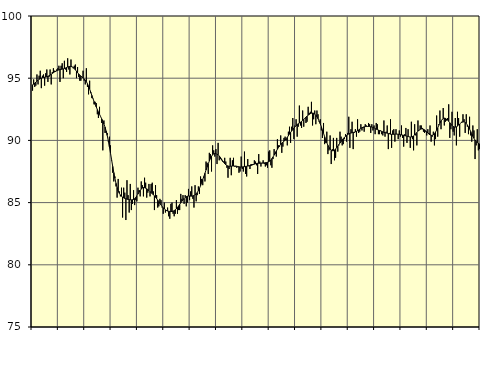
| Category | Piggar | Series 1 |
|---|---|---|
| nan | 94 | 94.47 |
| 87.0 | 94.9 | 94.52 |
| 87.0 | 94.3 | 94.6 |
| 87.0 | 94.4 | 94.69 |
| 87.0 | 95.3 | 94.77 |
| 87.0 | 94.5 | 94.84 |
| 87.0 | 95.2 | 94.91 |
| 87.0 | 95.6 | 94.97 |
| 87.0 | 94.2 | 95.01 |
| 87.0 | 95.2 | 95.04 |
| 87.0 | 95.3 | 95.06 |
| 87.0 | 94.4 | 95.08 |
| nan | 95.4 | 95.09 |
| 88.0 | 95.7 | 95.11 |
| 88.0 | 94.7 | 95.15 |
| 88.0 | 95.1 | 95.19 |
| 88.0 | 95.7 | 95.25 |
| 88.0 | 94.5 | 95.31 |
| 88.0 | 95.5 | 95.38 |
| 88.0 | 95.8 | 95.44 |
| 88.0 | 95.6 | 95.5 |
| 88.0 | 95.5 | 95.56 |
| 88.0 | 95.7 | 95.6 |
| 88.0 | 95.8 | 95.64 |
| nan | 96 | 95.67 |
| 89.0 | 94.7 | 95.7 |
| 89.0 | 96 | 95.71 |
| 89.0 | 96.2 | 95.73 |
| 89.0 | 95 | 95.75 |
| 89.0 | 96.4 | 95.78 |
| 89.0 | 95.7 | 95.82 |
| 89.0 | 95.5 | 95.86 |
| 89.0 | 96.6 | 95.9 |
| 89.0 | 95.7 | 95.93 |
| 89.0 | 95.3 | 95.95 |
| 89.0 | 96.5 | 95.95 |
| nan | 95.9 | 95.91 |
| 90.0 | 95.8 | 95.86 |
| 90.0 | 96 | 95.78 |
| 90.0 | 96.1 | 95.67 |
| 90.0 | 95 | 95.56 |
| 90.0 | 95.9 | 95.45 |
| 90.0 | 95.1 | 95.34 |
| 90.0 | 94.8 | 95.25 |
| 90.0 | 94.8 | 95.17 |
| 90.0 | 95.1 | 95.1 |
| 90.0 | 95.6 | 95.03 |
| 90.0 | 94.8 | 94.95 |
| nan | 94.5 | 94.85 |
| 91.0 | 95.8 | 94.72 |
| 91.0 | 94.3 | 94.56 |
| 91.0 | 93.7 | 94.36 |
| 91.0 | 94.8 | 94.13 |
| 91.0 | 93.8 | 93.88 |
| 91.0 | 93.4 | 93.62 |
| 91.0 | 93.4 | 93.37 |
| 91.0 | 92.9 | 93.13 |
| 91.0 | 93.1 | 92.9 |
| 91.0 | 93 | 92.69 |
| 91.0 | 92.1 | 92.48 |
| nan | 91.8 | 92.29 |
| 92.0 | 92.7 | 92.1 |
| 92.0 | 91.9 | 91.91 |
| 92.0 | 91.4 | 91.73 |
| 92.0 | 89.2 | 91.54 |
| 92.0 | 91.6 | 91.32 |
| 92.0 | 90.6 | 91.07 |
| 92.0 | 90.6 | 90.76 |
| 92.0 | 90.6 | 90.4 |
| 92.0 | 89.9 | 89.97 |
| 92.0 | 90.3 | 89.48 |
| 92.0 | 89.6 | 88.97 |
| nan | 88.4 | 88.44 |
| 93.0 | 87.4 | 87.91 |
| 93.0 | 86.7 | 87.41 |
| 93.0 | 87.1 | 86.96 |
| 93.0 | 86.3 | 86.55 |
| 93.0 | 85.4 | 86.22 |
| 93.0 | 86.9 | 85.95 |
| 93.0 | 85.9 | 85.75 |
| 93.0 | 85.5 | 85.61 |
| 93.0 | 86.2 | 85.51 |
| 93.0 | 83.8 | 85.44 |
| 93.0 | 86.2 | 85.38 |
| nan | 85.8 | 85.34 |
| 94.0 | 83.6 | 85.31 |
| 94.0 | 86.8 | 85.28 |
| 94.0 | 85.6 | 85.26 |
| 94.0 | 84.2 | 85.24 |
| 94.0 | 86.5 | 85.23 |
| 94.0 | 84.4 | 85.22 |
| 94.0 | 84.9 | 85.23 |
| 94.0 | 86 | 85.25 |
| 94.0 | 84.8 | 85.31 |
| 94.0 | 85.2 | 85.41 |
| 94.0 | 85.1 | 85.54 |
| nan | 86.2 | 85.69 |
| 95.0 | 86 | 85.84 |
| 95.0 | 85.5 | 85.99 |
| 95.0 | 86.7 | 86.09 |
| 95.0 | 86.4 | 86.17 |
| 95.0 | 85.5 | 86.21 |
| 95.0 | 87 | 86.2 |
| 95.0 | 86.6 | 86.16 |
| 95.0 | 85.4 | 86.11 |
| 95.0 | 85.8 | 86.04 |
| 95.0 | 86.5 | 85.96 |
| 95.0 | 85.5 | 85.88 |
| nan | 86.5 | 85.8 |
| 96.0 | 86.6 | 85.72 |
| 96.0 | 85.9 | 85.63 |
| 96.0 | 84.4 | 85.54 |
| 96.0 | 86.4 | 85.43 |
| 96.0 | 85.6 | 85.32 |
| 96.0 | 84.6 | 85.2 |
| 96.0 | 84.7 | 85.07 |
| 96.0 | 85.3 | 84.94 |
| 96.0 | 85.2 | 84.81 |
| 96.0 | 84.6 | 84.68 |
| 96.0 | 84.1 | 84.58 |
| nan | 85 | 84.49 |
| 97.0 | 84.2 | 84.42 |
| 97.0 | 84.4 | 84.36 |
| 97.0 | 84.6 | 84.32 |
| 97.0 | 83.9 | 84.3 |
| 97.0 | 83.7 | 84.29 |
| 97.0 | 84.9 | 84.28 |
| 97.0 | 85 | 84.29 |
| 97.0 | 84.1 | 84.31 |
| 97.0 | 83.9 | 84.35 |
| 97.0 | 84.1 | 84.42 |
| 97.0 | 85.2 | 84.51 |
| nan | 84.1 | 84.61 |
| 98.0 | 84.4 | 84.73 |
| 98.0 | 84.4 | 84.86 |
| 98.0 | 85.7 | 84.98 |
| 98.0 | 85.3 | 85.11 |
| 98.0 | 85.6 | 85.23 |
| 98.0 | 84.9 | 85.33 |
| 98.0 | 85.6 | 85.42 |
| 98.0 | 84.7 | 85.48 |
| 98.0 | 85 | 85.51 |
| 98.0 | 86.1 | 85.53 |
| 98.0 | 85.2 | 85.53 |
| nan | 85.9 | 85.52 |
| 99.0 | 86.3 | 85.52 |
| 99.0 | 85.3 | 85.54 |
| 99.0 | 84.6 | 85.57 |
| 99.0 | 86.4 | 85.62 |
| 99.0 | 85.1 | 85.7 |
| 99.0 | 85.6 | 85.81 |
| 99.0 | 86.3 | 85.96 |
| 99.0 | 85.7 | 86.14 |
| 99.0 | 87.1 | 86.36 |
| 99.0 | 86.9 | 86.6 |
| 99.0 | 86.4 | 86.85 |
| nan | 87 | 87.1 |
| 0.0 | 86.7 | 87.36 |
| 0.0 | 88.3 | 87.62 |
| 0.0 | 88.2 | 87.87 |
| 0.0 | 87.3 | 88.12 |
| 0.0 | 89 | 88.34 |
| 0.0 | 88.9 | 88.55 |
| 0.0 | 87.5 | 88.72 |
| 0.0 | 89.6 | 88.85 |
| 0.0 | 89.2 | 88.92 |
| 0.0 | 88.7 | 88.95 |
| 0.0 | 89.3 | 88.94 |
| nan | 88.1 | 88.9 |
| 1.0 | 89.8 | 88.84 |
| 1.0 | 88.4 | 88.75 |
| 1.0 | 88.5 | 88.64 |
| 1.0 | 88.4 | 88.51 |
| 1.0 | 88.3 | 88.37 |
| 1.0 | 88.3 | 88.24 |
| 1.0 | 88.6 | 88.13 |
| 1.0 | 88.3 | 88.04 |
| 1.0 | 87.8 | 87.97 |
| 1.0 | 87 | 87.94 |
| 1.0 | 87.7 | 87.92 |
| nan | 88.6 | 87.92 |
| 2.0 | 87.2 | 87.93 |
| 2.0 | 88.4 | 87.94 |
| 2.0 | 88.6 | 87.94 |
| 2.0 | 87.9 | 87.94 |
| 2.0 | 87.9 | 87.94 |
| 2.0 | 87.8 | 87.92 |
| 2.0 | 87.9 | 87.9 |
| 2.0 | 87.4 | 87.88 |
| 2.0 | 87.5 | 87.86 |
| 2.0 | 88.7 | 87.86 |
| 2.0 | 87.7 | 87.87 |
| nan | 87.5 | 87.88 |
| 3.0 | 89.1 | 87.89 |
| 3.0 | 87.3 | 87.91 |
| 3.0 | 87.1 | 87.92 |
| 3.0 | 88.5 | 87.94 |
| 3.0 | 88 | 87.95 |
| 3.0 | 87.7 | 87.97 |
| 3.0 | 88.1 | 87.99 |
| 3.0 | 88.1 | 88.02 |
| 3.0 | 88.1 | 88.06 |
| 3.0 | 88.4 | 88.09 |
| 3.0 | 88.3 | 88.12 |
| nan | 88 | 88.15 |
| 4.0 | 87.3 | 88.16 |
| 4.0 | 88.9 | 88.16 |
| 4.0 | 88.3 | 88.16 |
| 4.0 | 87.9 | 88.17 |
| 4.0 | 88.2 | 88.17 |
| 4.0 | 88.4 | 88.18 |
| 4.0 | 88.1 | 88.19 |
| 4.0 | 87.9 | 88.21 |
| 4.0 | 88 | 88.22 |
| 4.0 | 87.8 | 88.24 |
| 4.0 | 89.1 | 88.28 |
| nan | 89.2 | 88.33 |
| 5.0 | 88 | 88.42 |
| 5.0 | 87.8 | 88.54 |
| 5.0 | 88.5 | 88.67 |
| 5.0 | 89.3 | 88.82 |
| 5.0 | 88.9 | 88.98 |
| 5.0 | 88.7 | 89.14 |
| 5.0 | 90.1 | 89.29 |
| 5.0 | 89.6 | 89.44 |
| 5.0 | 89.5 | 89.57 |
| 5.0 | 90.4 | 89.68 |
| 5.0 | 89 | 89.77 |
| nan | 89.5 | 89.85 |
| 6.0 | 90.2 | 89.93 |
| 6.0 | 90.3 | 90.02 |
| 6.0 | 90 | 90.13 |
| 6.0 | 89.6 | 90.25 |
| 6.0 | 90.7 | 90.38 |
| 6.0 | 91.1 | 90.51 |
| 6.0 | 89.8 | 90.64 |
| 6.0 | 91.1 | 90.76 |
| 6.0 | 91.8 | 90.87 |
| 6.0 | 90.1 | 90.98 |
| 6.0 | 91.2 | 91.09 |
| nan | 91.7 | 91.19 |
| 7.0 | 90.3 | 91.27 |
| 7.0 | 91.1 | 91.34 |
| 7.0 | 92.8 | 91.4 |
| 7.0 | 91.2 | 91.46 |
| 7.0 | 91 | 91.53 |
| 7.0 | 92.4 | 91.6 |
| 7.0 | 91.1 | 91.69 |
| 7.0 | 91.8 | 91.78 |
| 7.0 | 91.4 | 91.87 |
| 7.0 | 91.5 | 91.95 |
| 7.0 | 92.7 | 92.03 |
| nan | 92.2 | 92.09 |
| 8.0 | 92.3 | 92.15 |
| 8.0 | 93.1 | 92.19 |
| 8.0 | 91.2 | 92.2 |
| 8.0 | 91.7 | 92.18 |
| 8.0 | 92.4 | 92.12 |
| 8.0 | 91.3 | 92.03 |
| 8.0 | 92.4 | 91.9 |
| 8.0 | 92.1 | 91.74 |
| 8.0 | 91.5 | 91.55 |
| 8.0 | 91.7 | 91.34 |
| 8.0 | 90.8 | 91.1 |
| nan | 90.2 | 90.84 |
| 9.0 | 91.4 | 90.57 |
| 9.0 | 89.7 | 90.3 |
| 9.0 | 89.8 | 90.04 |
| 9.0 | 90.7 | 89.81 |
| 9.0 | 88.9 | 89.61 |
| 9.0 | 89.2 | 89.44 |
| 9.0 | 90.4 | 89.3 |
| 9.0 | 88.1 | 89.21 |
| 9.0 | 89.3 | 89.17 |
| 9.0 | 90.2 | 89.17 |
| 9.0 | 88.4 | 89.22 |
| nan | 88.6 | 89.31 |
| 10.0 | 90.2 | 89.42 |
| 10.0 | 89.1 | 89.54 |
| 10.0 | 89.6 | 89.67 |
| 10.0 | 90.7 | 89.79 |
| 10.0 | 90.3 | 89.91 |
| 10.0 | 89.6 | 90.03 |
| 10.0 | 89.7 | 90.14 |
| 10.0 | 90.1 | 90.24 |
| 10.0 | 90.5 | 90.33 |
| 10.0 | 89.9 | 90.4 |
| 10.0 | 90.6 | 90.46 |
| nan | 91.9 | 90.52 |
| 11.0 | 89.4 | 90.56 |
| 11.0 | 90.9 | 90.59 |
| 11.0 | 91.5 | 90.62 |
| 11.0 | 89.3 | 90.64 |
| 11.0 | 90.6 | 90.66 |
| 11.0 | 90.9 | 90.69 |
| 11.0 | 90.3 | 90.73 |
| 11.0 | 91.7 | 90.78 |
| 11.0 | 90.6 | 90.84 |
| 11.0 | 90.7 | 90.91 |
| 11.0 | 91.3 | 90.97 |
| nan | 90.8 | 91.02 |
| 12.0 | 91 | 91.06 |
| 12.0 | 90.7 | 91.09 |
| 12.0 | 91.3 | 91.11 |
| 12.0 | 91.2 | 91.12 |
| 12.0 | 91.1 | 91.12 |
| 12.0 | 91.4 | 91.12 |
| 12.0 | 91.3 | 91.12 |
| 12.0 | 90.6 | 91.1 |
| 12.0 | 91.3 | 91.07 |
| 12.0 | 90.8 | 91.04 |
| 12.0 | 91.2 | 91 |
| nan | 90.5 | 90.95 |
| 13.0 | 91.4 | 90.9 |
| 13.0 | 91.3 | 90.87 |
| 13.0 | 90.5 | 90.83 |
| 13.0 | 90.5 | 90.79 |
| 13.0 | 90.8 | 90.76 |
| 13.0 | 90.5 | 90.72 |
| 13.0 | 90.4 | 90.69 |
| 13.0 | 91.6 | 90.65 |
| 13.0 | 90.3 | 90.62 |
| 13.0 | 90.7 | 90.6 |
| 13.0 | 91.2 | 90.58 |
| nan | 89.3 | 90.55 |
| 14.0 | 90.6 | 90.53 |
| 14.0 | 91.7 | 90.5 |
| 14.0 | 89.4 | 90.49 |
| 14.0 | 90.8 | 90.49 |
| 14.0 | 90.9 | 90.49 |
| 14.0 | 89.9 | 90.5 |
| 14.0 | 90.9 | 90.51 |
| 14.0 | 90.5 | 90.5 |
| 14.0 | 90.1 | 90.5 |
| 14.0 | 90.8 | 90.48 |
| 14.0 | 90.3 | 90.46 |
| nan | 91.2 | 90.44 |
| 15.0 | 90.2 | 90.43 |
| 15.0 | 89.5 | 90.41 |
| 15.0 | 90.5 | 90.38 |
| 15.0 | 91 | 90.36 |
| 15.0 | 89.8 | 90.34 |
| 15.0 | 90.9 | 90.31 |
| 15.0 | 90.3 | 90.29 |
| 15.0 | 89.4 | 90.27 |
| 15.0 | 91.5 | 90.28 |
| 15.0 | 90.1 | 90.31 |
| 15.0 | 89.2 | 90.36 |
| nan | 91.3 | 90.44 |
| 16.0 | 90.4 | 90.53 |
| 16.0 | 89.6 | 90.64 |
| 16.0 | 91.6 | 90.74 |
| 16.0 | 90.8 | 90.83 |
| 16.0 | 91.2 | 90.89 |
| 16.0 | 91.2 | 90.92 |
| 16.0 | 91 | 90.92 |
| 16.0 | 90.7 | 90.9 |
| 16.0 | 90.6 | 90.85 |
| 16.0 | 90.7 | 90.77 |
| 16.0 | 90.4 | 90.69 |
| nan | 90.9 | 90.59 |
| 17.0 | 90.6 | 90.51 |
| 17.0 | 91.2 | 90.44 |
| 17.0 | 89.9 | 90.41 |
| 17.0 | 90.3 | 90.41 |
| 17.0 | 90.7 | 90.45 |
| 17.0 | 89.6 | 90.54 |
| 17.0 | 90.1 | 90.67 |
| 17.0 | 92 | 90.83 |
| 17.0 | 90.3 | 91.01 |
| 17.0 | 91.3 | 91.21 |
| 17.0 | 92.4 | 91.4 |
| nan | 90.9 | 91.56 |
| 18.0 | 91.7 | 91.68 |
| 18.0 | 92.6 | 91.76 |
| 18.0 | 91.2 | 91.79 |
| 18.0 | 91.5 | 91.77 |
| 18.0 | 91.6 | 91.72 |
| 18.0 | 91.8 | 91.63 |
| 18.0 | 92.9 | 91.53 |
| 18.0 | 90.2 | 91.42 |
| 18.0 | 90.9 | 91.3 |
| 18.0 | 92.3 | 91.2 |
| 18.0 | 90.7 | 91.12 |
| nan | 90.4 | 91.08 |
| 19.0 | 91.8 | 91.07 |
| 19.0 | 89.6 | 91.09 |
| 19.0 | 92.3 | 91.15 |
| 19.0 | 91.8 | 91.23 |
| 19.0 | 90.3 | 91.32 |
| 19.0 | 91.4 | 91.4 |
| 19.0 | 91.5 | 91.46 |
| 19.0 | 92.1 | 91.48 |
| 19.0 | 91.7 | 91.49 |
| 19.0 | 90.6 | 91.44 |
| 19.0 | 92.1 | 91.36 |
| nan | 91.1 | 91.24 |
| 20.0 | 90.5 | 91.09 |
| 20.0 | 91.9 | 90.91 |
| 20.0 | 90.4 | 90.72 |
| 20.0 | 89.9 | 90.52 |
| 20.0 | 91.2 | 90.33 |
| 20.0 | 90.8 | 90.17 |
| 20.0 | 88.5 | 90.03 |
| 20.0 | 89.6 | 89.91 |
| 20.0 | 90.9 | 89.82 |
| 20.0 | 89.2 | 89.76 |
| 20.0 | 89.3 | 89.73 |